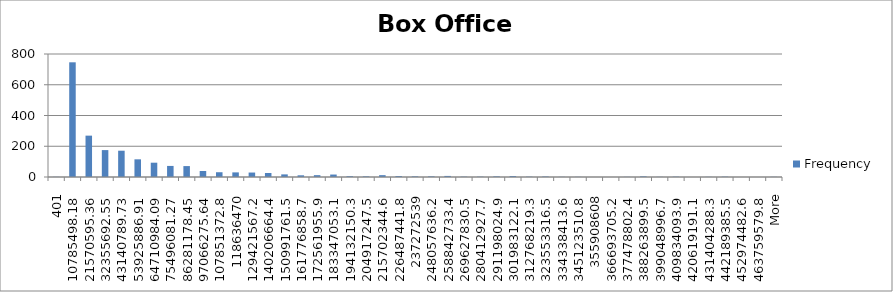
| Category | Frequency |
|---|---|
| 401 | 1 |
| 10785498.18 | 746 |
| 21570595.36 | 269 |
| 32355692.55 | 175 |
| 43140789.73 | 171 |
| 53925886.91 | 115 |
| 64710984.09 | 93 |
| 75496081.27 | 72 |
| 86281178.45 | 71 |
| 97066275.64 | 39 |
| 107851372.8 | 31 |
| 118636470 | 30 |
| 129421567.2 | 29 |
| 140206664.4 | 26 |
| 150991761.5 | 17 |
| 161776858.7 | 11 |
| 172561955.9 | 12 |
| 183347053.1 | 16 |
| 194132150.3 | 5 |
| 204917247.5 | 4 |
| 215702344.6 | 12 |
| 226487441.8 | 6 |
| 237272539 | 4 |
| 248057636.2 | 4 |
| 258842733.4 | 7 |
| 269627830.5 | 2 |
| 280412927.7 | 2 |
| 291198024.9 | 4 |
| 301983122.1 | 6 |
| 312768219.3 | 2 |
| 323553316.5 | 3 |
| 334338413.6 | 1 |
| 345123510.8 | 1 |
| 355908608 | 0 |
| 366693705.2 | 0 |
| 377478802.4 | 1 |
| 388263899.5 | 4 |
| 399048996.7 | 1 |
| 409834093.9 | 2 |
| 420619191.1 | 0 |
| 431404288.3 | 1 |
| 442189385.5 | 2 |
| 452974482.6 | 0 |
| 463759579.8 | 0 |
| More | 1 |